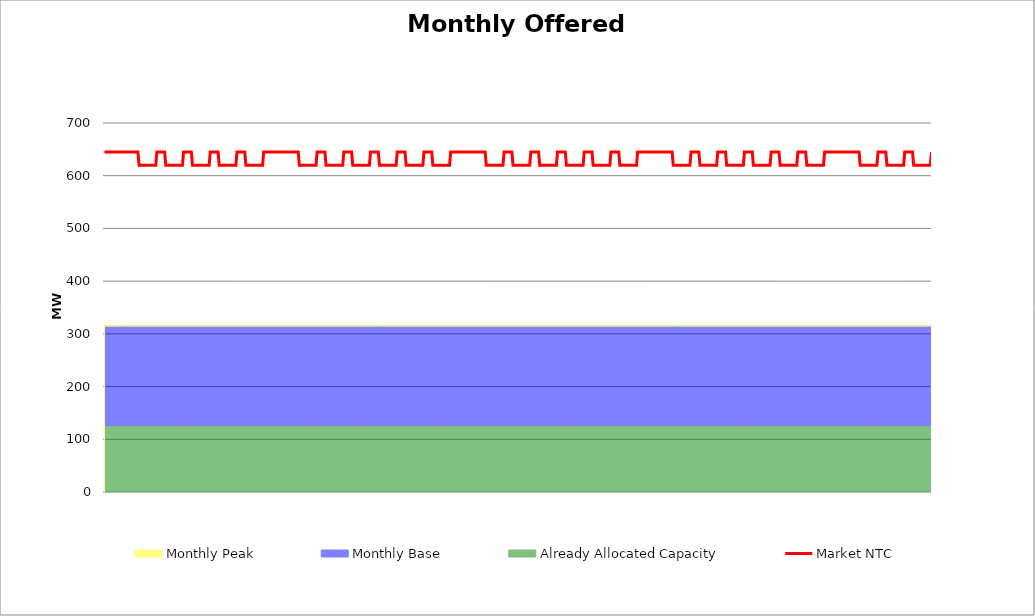
| Category | Market NTC |
|---|---|
| 0 | 645 |
| 1 | 645 |
| 2 | 645 |
| 3 | 645 |
| 4 | 645 |
| 5 | 645 |
| 6 | 645 |
| 7 | 645 |
| 8 | 645 |
| 9 | 645 |
| 10 | 645 |
| 11 | 645 |
| 12 | 645 |
| 13 | 645 |
| 14 | 645 |
| 15 | 645 |
| 16 | 645 |
| 17 | 645 |
| 18 | 645 |
| 19 | 645 |
| 20 | 645 |
| 21 | 645 |
| 22 | 645 |
| 23 | 645 |
| 24 | 645 |
| 25 | 645 |
| 26 | 645 |
| 27 | 645 |
| 28 | 645 |
| 29 | 645 |
| 30 | 645 |
| 31 | 620 |
| 32 | 620 |
| 33 | 620 |
| 34 | 620 |
| 35 | 620 |
| 36 | 620 |
| 37 | 620 |
| 38 | 620 |
| 39 | 620 |
| 40 | 620 |
| 41 | 620 |
| 42 | 620 |
| 43 | 620 |
| 44 | 620 |
| 45 | 620 |
| 46 | 620 |
| 47 | 645 |
| 48 | 645 |
| 49 | 645 |
| 50 | 645 |
| 51 | 645 |
| 52 | 645 |
| 53 | 645 |
| 54 | 645 |
| 55 | 620 |
| 56 | 620 |
| 57 | 620 |
| 58 | 620 |
| 59 | 620 |
| 60 | 620 |
| 61 | 620 |
| 62 | 620 |
| 63 | 620 |
| 64 | 620 |
| 65 | 620 |
| 66 | 620 |
| 67 | 620 |
| 68 | 620 |
| 69 | 620 |
| 70 | 620 |
| 71 | 645 |
| 72 | 645 |
| 73 | 645 |
| 74 | 645 |
| 75 | 645 |
| 76 | 645 |
| 77 | 645 |
| 78 | 645 |
| 79 | 620 |
| 80 | 620 |
| 81 | 620 |
| 82 | 620 |
| 83 | 620 |
| 84 | 620 |
| 85 | 620 |
| 86 | 620 |
| 87 | 620 |
| 88 | 620 |
| 89 | 620 |
| 90 | 620 |
| 91 | 620 |
| 92 | 620 |
| 93 | 620 |
| 94 | 620 |
| 95 | 645 |
| 96 | 645 |
| 97 | 645 |
| 98 | 645 |
| 99 | 645 |
| 100 | 645 |
| 101 | 645 |
| 102 | 645 |
| 103 | 620 |
| 104 | 620 |
| 105 | 620 |
| 106 | 620 |
| 107 | 620 |
| 108 | 620 |
| 109 | 620 |
| 110 | 620 |
| 111 | 620 |
| 112 | 620 |
| 113 | 620 |
| 114 | 620 |
| 115 | 620 |
| 116 | 620 |
| 117 | 620 |
| 118 | 620 |
| 119 | 645 |
| 120 | 645 |
| 121 | 645 |
| 122 | 645 |
| 123 | 645 |
| 124 | 645 |
| 125 | 645 |
| 126 | 645 |
| 127 | 620 |
| 128 | 620 |
| 129 | 620 |
| 130 | 620 |
| 131 | 620 |
| 132 | 620 |
| 133 | 620 |
| 134 | 620 |
| 135 | 620 |
| 136 | 620 |
| 137 | 620 |
| 138 | 620 |
| 139 | 620 |
| 140 | 620 |
| 141 | 620 |
| 142 | 620 |
| 143 | 645 |
| 144 | 645 |
| 145 | 645 |
| 146 | 645 |
| 147 | 645 |
| 148 | 645 |
| 149 | 645 |
| 150 | 645 |
| 151 | 645 |
| 152 | 645 |
| 153 | 645 |
| 154 | 645 |
| 155 | 645 |
| 156 | 645 |
| 157 | 645 |
| 158 | 645 |
| 159 | 645 |
| 160 | 645 |
| 161 | 645 |
| 162 | 645 |
| 163 | 645 |
| 164 | 645 |
| 165 | 645 |
| 166 | 645 |
| 167 | 645 |
| 168 | 645 |
| 169 | 645 |
| 170 | 645 |
| 171 | 645 |
| 172 | 645 |
| 173 | 645 |
| 174 | 645 |
| 175 | 620 |
| 176 | 620 |
| 177 | 620 |
| 178 | 620 |
| 179 | 620 |
| 180 | 620 |
| 181 | 620 |
| 182 | 620 |
| 183 | 620 |
| 184 | 620 |
| 185 | 620 |
| 186 | 620 |
| 187 | 620 |
| 188 | 620 |
| 189 | 620 |
| 190 | 620 |
| 191 | 645 |
| 192 | 645 |
| 193 | 645 |
| 194 | 645 |
| 195 | 645 |
| 196 | 645 |
| 197 | 645 |
| 198 | 645 |
| 199 | 620 |
| 200 | 620 |
| 201 | 620 |
| 202 | 620 |
| 203 | 620 |
| 204 | 620 |
| 205 | 620 |
| 206 | 620 |
| 207 | 620 |
| 208 | 620 |
| 209 | 620 |
| 210 | 620 |
| 211 | 620 |
| 212 | 620 |
| 213 | 620 |
| 214 | 620 |
| 215 | 645 |
| 216 | 645 |
| 217 | 645 |
| 218 | 645 |
| 219 | 645 |
| 220 | 645 |
| 221 | 645 |
| 222 | 645 |
| 223 | 620 |
| 224 | 620 |
| 225 | 620 |
| 226 | 620 |
| 227 | 620 |
| 228 | 620 |
| 229 | 620 |
| 230 | 620 |
| 231 | 620 |
| 232 | 620 |
| 233 | 620 |
| 234 | 620 |
| 235 | 620 |
| 236 | 620 |
| 237 | 620 |
| 238 | 620 |
| 239 | 645 |
| 240 | 645 |
| 241 | 645 |
| 242 | 645 |
| 243 | 645 |
| 244 | 645 |
| 245 | 645 |
| 246 | 645 |
| 247 | 620 |
| 248 | 620 |
| 249 | 620 |
| 250 | 620 |
| 251 | 620 |
| 252 | 620 |
| 253 | 620 |
| 254 | 620 |
| 255 | 620 |
| 256 | 620 |
| 257 | 620 |
| 258 | 620 |
| 259 | 620 |
| 260 | 620 |
| 261 | 620 |
| 262 | 620 |
| 263 | 645 |
| 264 | 645 |
| 265 | 645 |
| 266 | 645 |
| 267 | 645 |
| 268 | 645 |
| 269 | 645 |
| 270 | 645 |
| 271 | 620 |
| 272 | 620 |
| 273 | 620 |
| 274 | 620 |
| 275 | 620 |
| 276 | 620 |
| 277 | 620 |
| 278 | 620 |
| 279 | 620 |
| 280 | 620 |
| 281 | 620 |
| 282 | 620 |
| 283 | 620 |
| 284 | 620 |
| 285 | 620 |
| 286 | 620 |
| 287 | 645 |
| 288 | 645 |
| 289 | 645 |
| 290 | 645 |
| 291 | 645 |
| 292 | 645 |
| 293 | 645 |
| 294 | 645 |
| 295 | 620 |
| 296 | 620 |
| 297 | 620 |
| 298 | 620 |
| 299 | 620 |
| 300 | 620 |
| 301 | 620 |
| 302 | 620 |
| 303 | 620 |
| 304 | 620 |
| 305 | 620 |
| 306 | 620 |
| 307 | 620 |
| 308 | 620 |
| 309 | 620 |
| 310 | 620 |
| 311 | 645 |
| 312 | 645 |
| 313 | 645 |
| 314 | 645 |
| 315 | 645 |
| 316 | 645 |
| 317 | 645 |
| 318 | 645 |
| 319 | 645 |
| 320 | 645 |
| 321 | 645 |
| 322 | 645 |
| 323 | 645 |
| 324 | 645 |
| 325 | 645 |
| 326 | 645 |
| 327 | 645 |
| 328 | 645 |
| 329 | 645 |
| 330 | 645 |
| 331 | 645 |
| 332 | 645 |
| 333 | 645 |
| 334 | 645 |
| 335 | 645 |
| 336 | 645 |
| 337 | 645 |
| 338 | 645 |
| 339 | 645 |
| 340 | 645 |
| 341 | 645 |
| 342 | 645 |
| 343 | 620 |
| 344 | 620 |
| 345 | 620 |
| 346 | 620 |
| 347 | 620 |
| 348 | 620 |
| 349 | 620 |
| 350 | 620 |
| 351 | 620 |
| 352 | 620 |
| 353 | 620 |
| 354 | 620 |
| 355 | 620 |
| 356 | 620 |
| 357 | 620 |
| 358 | 620 |
| 359 | 645 |
| 360 | 645 |
| 361 | 645 |
| 362 | 645 |
| 363 | 645 |
| 364 | 645 |
| 365 | 645 |
| 366 | 645 |
| 367 | 620 |
| 368 | 620 |
| 369 | 620 |
| 370 | 620 |
| 371 | 620 |
| 372 | 620 |
| 373 | 620 |
| 374 | 620 |
| 375 | 620 |
| 376 | 620 |
| 377 | 620 |
| 378 | 620 |
| 379 | 620 |
| 380 | 620 |
| 381 | 620 |
| 382 | 620 |
| 383 | 645 |
| 384 | 645 |
| 385 | 645 |
| 386 | 645 |
| 387 | 645 |
| 388 | 645 |
| 389 | 645 |
| 390 | 645 |
| 391 | 620 |
| 392 | 620 |
| 393 | 620 |
| 394 | 620 |
| 395 | 620 |
| 396 | 620 |
| 397 | 620 |
| 398 | 620 |
| 399 | 620 |
| 400 | 620 |
| 401 | 620 |
| 402 | 620 |
| 403 | 620 |
| 404 | 620 |
| 405 | 620 |
| 406 | 620 |
| 407 | 645 |
| 408 | 645 |
| 409 | 645 |
| 410 | 645 |
| 411 | 645 |
| 412 | 645 |
| 413 | 645 |
| 414 | 645 |
| 415 | 620 |
| 416 | 620 |
| 417 | 620 |
| 418 | 620 |
| 419 | 620 |
| 420 | 620 |
| 421 | 620 |
| 422 | 620 |
| 423 | 620 |
| 424 | 620 |
| 425 | 620 |
| 426 | 620 |
| 427 | 620 |
| 428 | 620 |
| 429 | 620 |
| 430 | 620 |
| 431 | 645 |
| 432 | 645 |
| 433 | 645 |
| 434 | 645 |
| 435 | 645 |
| 436 | 645 |
| 437 | 645 |
| 438 | 645 |
| 439 | 620 |
| 440 | 620 |
| 441 | 620 |
| 442 | 620 |
| 443 | 620 |
| 444 | 620 |
| 445 | 620 |
| 446 | 620 |
| 447 | 620 |
| 448 | 620 |
| 449 | 620 |
| 450 | 620 |
| 451 | 620 |
| 452 | 620 |
| 453 | 620 |
| 454 | 620 |
| 455 | 645 |
| 456 | 645 |
| 457 | 645 |
| 458 | 645 |
| 459 | 645 |
| 460 | 645 |
| 461 | 645 |
| 462 | 645 |
| 463 | 620 |
| 464 | 620 |
| 465 | 620 |
| 466 | 620 |
| 467 | 620 |
| 468 | 620 |
| 469 | 620 |
| 470 | 620 |
| 471 | 620 |
| 472 | 620 |
| 473 | 620 |
| 474 | 620 |
| 475 | 620 |
| 476 | 620 |
| 477 | 620 |
| 478 | 620 |
| 479 | 645 |
| 480 | 645 |
| 481 | 645 |
| 482 | 645 |
| 483 | 645 |
| 484 | 645 |
| 485 | 645 |
| 486 | 645 |
| 487 | 645 |
| 488 | 645 |
| 489 | 645 |
| 490 | 645 |
| 491 | 645 |
| 492 | 645 |
| 493 | 645 |
| 494 | 645 |
| 495 | 645 |
| 496 | 645 |
| 497 | 645 |
| 498 | 645 |
| 499 | 645 |
| 500 | 645 |
| 501 | 645 |
| 502 | 645 |
| 503 | 645 |
| 504 | 645 |
| 505 | 645 |
| 506 | 645 |
| 507 | 645 |
| 508 | 645 |
| 509 | 645 |
| 510 | 645 |
| 511 | 620 |
| 512 | 620 |
| 513 | 620 |
| 514 | 620 |
| 515 | 620 |
| 516 | 620 |
| 517 | 620 |
| 518 | 620 |
| 519 | 620 |
| 520 | 620 |
| 521 | 620 |
| 522 | 620 |
| 523 | 620 |
| 524 | 620 |
| 525 | 620 |
| 526 | 620 |
| 527 | 645 |
| 528 | 645 |
| 529 | 645 |
| 530 | 645 |
| 531 | 645 |
| 532 | 645 |
| 533 | 645 |
| 534 | 645 |
| 535 | 620 |
| 536 | 620 |
| 537 | 620 |
| 538 | 620 |
| 539 | 620 |
| 540 | 620 |
| 541 | 620 |
| 542 | 620 |
| 543 | 620 |
| 544 | 620 |
| 545 | 620 |
| 546 | 620 |
| 547 | 620 |
| 548 | 620 |
| 549 | 620 |
| 550 | 620 |
| 551 | 645 |
| 552 | 645 |
| 553 | 645 |
| 554 | 645 |
| 555 | 645 |
| 556 | 645 |
| 557 | 645 |
| 558 | 645 |
| 559 | 620 |
| 560 | 620 |
| 561 | 620 |
| 562 | 620 |
| 563 | 620 |
| 564 | 620 |
| 565 | 620 |
| 566 | 620 |
| 567 | 620 |
| 568 | 620 |
| 569 | 620 |
| 570 | 620 |
| 571 | 620 |
| 572 | 620 |
| 573 | 620 |
| 574 | 620 |
| 575 | 645 |
| 576 | 645 |
| 577 | 645 |
| 578 | 645 |
| 579 | 645 |
| 580 | 645 |
| 581 | 645 |
| 582 | 645 |
| 583 | 620 |
| 584 | 620 |
| 585 | 620 |
| 586 | 620 |
| 587 | 620 |
| 588 | 620 |
| 589 | 620 |
| 590 | 620 |
| 591 | 620 |
| 592 | 620 |
| 593 | 620 |
| 594 | 620 |
| 595 | 620 |
| 596 | 620 |
| 597 | 620 |
| 598 | 620 |
| 599 | 645 |
| 600 | 645 |
| 601 | 645 |
| 602 | 645 |
| 603 | 645 |
| 604 | 645 |
| 605 | 645 |
| 606 | 645 |
| 607 | 620 |
| 608 | 620 |
| 609 | 620 |
| 610 | 620 |
| 611 | 620 |
| 612 | 620 |
| 613 | 620 |
| 614 | 620 |
| 615 | 620 |
| 616 | 620 |
| 617 | 620 |
| 618 | 620 |
| 619 | 620 |
| 620 | 620 |
| 621 | 620 |
| 622 | 620 |
| 623 | 645 |
| 624 | 645 |
| 625 | 645 |
| 626 | 645 |
| 627 | 645 |
| 628 | 645 |
| 629 | 645 |
| 630 | 645 |
| 631 | 620 |
| 632 | 620 |
| 633 | 620 |
| 634 | 620 |
| 635 | 620 |
| 636 | 620 |
| 637 | 620 |
| 638 | 620 |
| 639 | 620 |
| 640 | 620 |
| 641 | 620 |
| 642 | 620 |
| 643 | 620 |
| 644 | 620 |
| 645 | 620 |
| 646 | 620 |
| 647 | 645 |
| 648 | 645 |
| 649 | 645 |
| 650 | 645 |
| 651 | 645 |
| 652 | 645 |
| 653 | 645 |
| 654 | 645 |
| 655 | 645 |
| 656 | 645 |
| 657 | 645 |
| 658 | 645 |
| 659 | 645 |
| 660 | 645 |
| 661 | 645 |
| 662 | 645 |
| 663 | 645 |
| 664 | 645 |
| 665 | 645 |
| 666 | 645 |
| 667 | 645 |
| 668 | 645 |
| 669 | 645 |
| 670 | 645 |
| 671 | 645 |
| 672 | 645 |
| 673 | 645 |
| 674 | 645 |
| 675 | 645 |
| 676 | 645 |
| 677 | 645 |
| 678 | 645 |
| 679 | 620 |
| 680 | 620 |
| 681 | 620 |
| 682 | 620 |
| 683 | 620 |
| 684 | 620 |
| 685 | 620 |
| 686 | 620 |
| 687 | 620 |
| 688 | 620 |
| 689 | 620 |
| 690 | 620 |
| 691 | 620 |
| 692 | 620 |
| 693 | 620 |
| 694 | 620 |
| 695 | 645 |
| 696 | 645 |
| 697 | 645 |
| 698 | 645 |
| 699 | 645 |
| 700 | 645 |
| 701 | 645 |
| 702 | 645 |
| 703 | 620 |
| 704 | 620 |
| 705 | 620 |
| 706 | 620 |
| 707 | 620 |
| 708 | 620 |
| 709 | 620 |
| 710 | 620 |
| 711 | 620 |
| 712 | 620 |
| 713 | 620 |
| 714 | 620 |
| 715 | 620 |
| 716 | 620 |
| 717 | 620 |
| 718 | 620 |
| 719 | 645 |
| 720 | 645 |
| 721 | 645 |
| 722 | 645 |
| 723 | 645 |
| 724 | 645 |
| 725 | 645 |
| 726 | 645 |
| 727 | 620 |
| 728 | 620 |
| 729 | 620 |
| 730 | 620 |
| 731 | 620 |
| 732 | 620 |
| 733 | 620 |
| 734 | 620 |
| 735 | 620 |
| 736 | 620 |
| 737 | 620 |
| 738 | 620 |
| 739 | 620 |
| 740 | 620 |
| 741 | 620 |
| 742 | 620 |
| 743 | 645 |